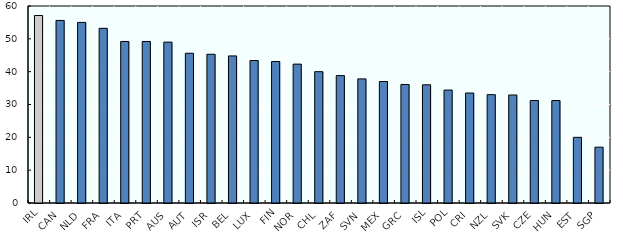
| Category | Series 0 |
|---|---|
| IRL | 57.1 |
| CAN | 55.6 |
| NLD | 55 |
| FRA | 53.2 |
| ITA | 49.2 |
| PRT | 49.2 |
| AUS | 49 |
| AUT | 45.6 |
| ISR | 45.3 |
| BEL | 44.8 |
| LUX | 43.4 |
| FIN | 43.1 |
| NOR | 42.3 |
| CHL | 40 |
| ZAF | 38.8 |
| SVN | 37.8 |
| MEX | 37 |
| GRC | 36.1 |
| ISL | 36 |
| POL | 34.4 |
| CRI | 33.5 |
| NZL | 33 |
| SVK | 32.9 |
| CZE | 31.2 |
| HUN | 31.2 |
| EST | 20 |
| SGP | 17 |